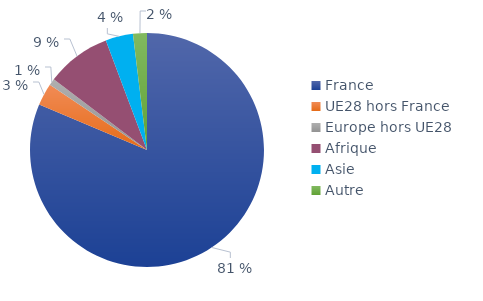
| Category | Series 0 |
|---|---|
| France | 0.813 |
| UE28 hors France | 0.031 |
| Europe hors UE28 | 0.009 |
| Afrique | 0.09 |
| Asie | 0.038 |
| Autre | 0.019 |